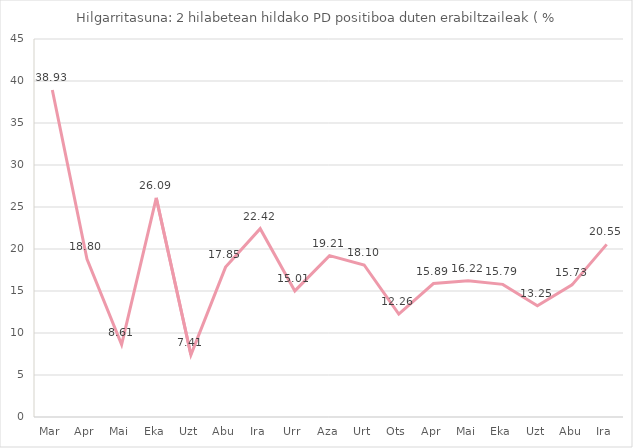
| Category | Hilgarritasuna:
(B/A) |
|---|---|
| 0 | 38.926 |
| 1 | 18.799 |
| 2 | 8.612 |
| 3 | 26.087 |
| 4 | 7.407 |
| 5 | 17.848 |
| 6 | 22.421 |
| 7 | 15.012 |
| 8 | 19.213 |
| 9 | 18.1 |
| 10 | 12.258 |
| 11 | 15.888 |
| 12 | 16.216 |
| 13 | 15.789 |
| 14 | 13.253 |
| 15 | 15.726 |
| 16 | 20.548 |